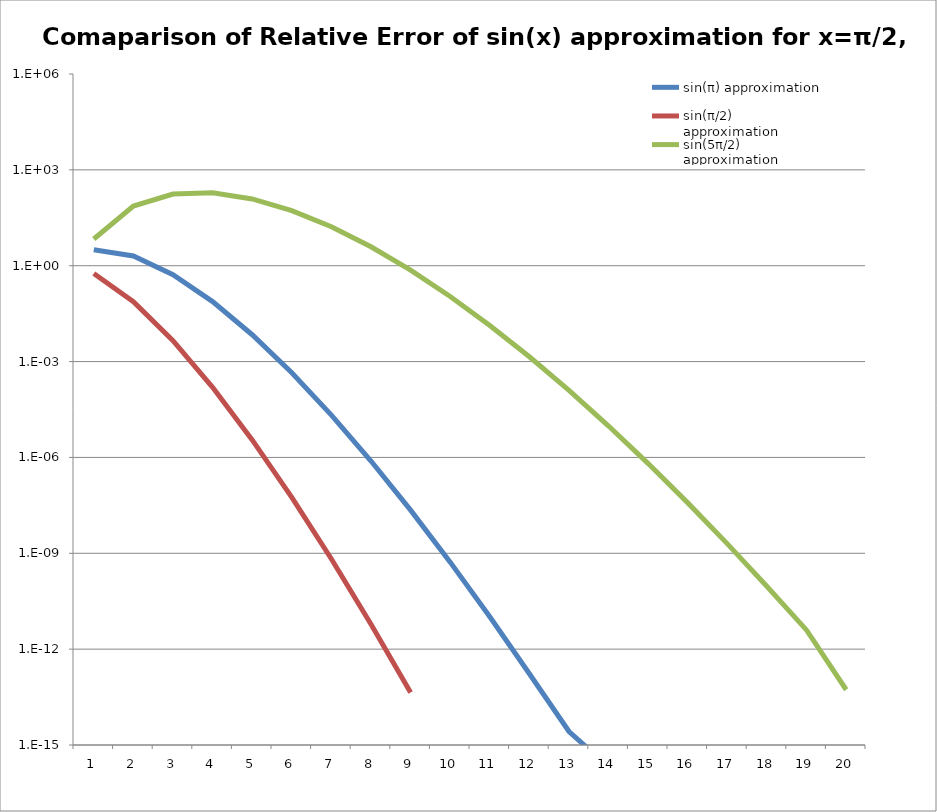
| Category | sin(π) approximation | sin(π/2) approximation | sin(5π/2) approximation |
|---|---|---|---|
| 1.0 | 3.142 | 0.571 | 6.854 |
| 2.0 | 2.026 | 0.075 | 73.892 |
| 3.0 | 0.524 | 0.005 | 175.148 |
| 4.0 | 0.075 | 0 | 190.614 |
| 5.0 | 0.007 | 0 | 122.748 |
| 6.0 | 0 | 0 | 52.977 |
| 7.0 | 0 | 0 | 16.507 |
| 8.0 | 0 | 0 | 3.903 |
| 9.0 | 0 | 0 | 0.726 |
| 10.0 | 0 | 0 | 0.109 |
| 11.0 | 0 | 0 | 0.014 |
| 12.0 | 0 | 0 | 0.001 |
| 13.0 | 0 | 0 | 0 |
| 14.0 | 0 | 0 | 0 |
| 15.0 | 0 | 0 | 0 |
| 16.0 | 0 | 0 | 0 |
| 17.0 | 0 | 0 | 0 |
| 18.0 | 0 | 0 | 0 |
| 19.0 | 0 | 0 | 0 |
| 20.0 | 0 | 0 | 0 |